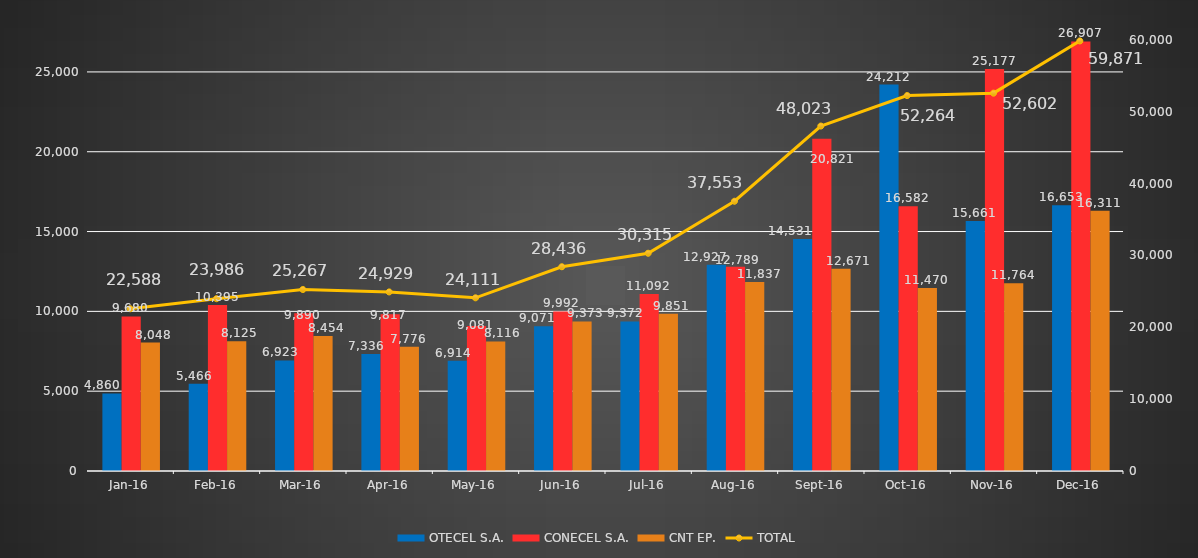
| Category | OTECEL S.A. | CONECEL S.A. | CNT EP. |
|---|---|---|---|
| 2016-01-01 | 4860 | 9680 | 8048 |
| 2016-02-01 | 5466 | 10395 | 8125 |
| 2016-03-01 | 6923 | 9890 | 8454 |
| 2016-04-01 | 7336 | 9817 | 7776 |
| 2016-05-01 | 6914 | 9081 | 8116 |
| 2016-06-01 | 9071 | 9992 | 9373 |
| 2016-07-01 | 9372 | 11092 | 9851 |
| 2016-08-01 | 12927 | 12789 | 11837 |
| 2016-09-01 | 14531 | 20821 | 12671 |
| 2016-10-01 | 24212 | 16582 | 11470 |
| 2016-11-01 | 15661 | 25177 | 11764 |
| 2016-12-01 | 16653 | 26907 | 16311 |